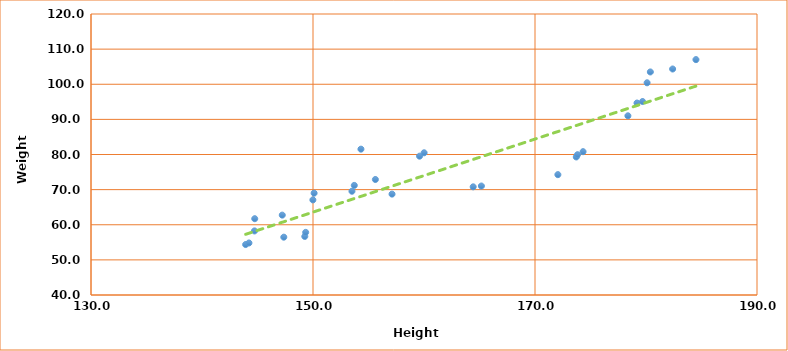
| Category | Weight (Kg) |
|---|---|
| 143.93 | 54.36 |
| 144.23 | 54.81 |
| 144.73 | 58.24 |
| 144.75 | 61.72 |
| 147.23 | 62.74 |
| 147.37 | 56.46 |
| 149.26 | 56.67 |
| 149.34 | 57.83 |
| 149.99 | 67.07 |
| 150.1 | 68.99 |
| 153.51 | 69.54 |
| 153.72 | 71.2 |
| 154.32 | 81.52 |
| 155.62 | 72.88 |
| 157.12 | 68.72 |
| 159.6 | 79.52 |
| 160.01 | 80.48 |
| 164.43 | 70.79 |
| 165.17 | 71.02 |
| 172.06 | 74.26 |
| 173.72 | 79.3 |
| 173.83 | 79.94 |
| 174.33 | 80.8 |
| 178.37 | 91.01 |
| 179.19 | 94.65 |
| 179.69 | 95.08 |
| 180.1 | 100.41 |
| 180.39 | 103.5 |
| 182.4 | 104.34 |
| 184.5 | 107.01 |